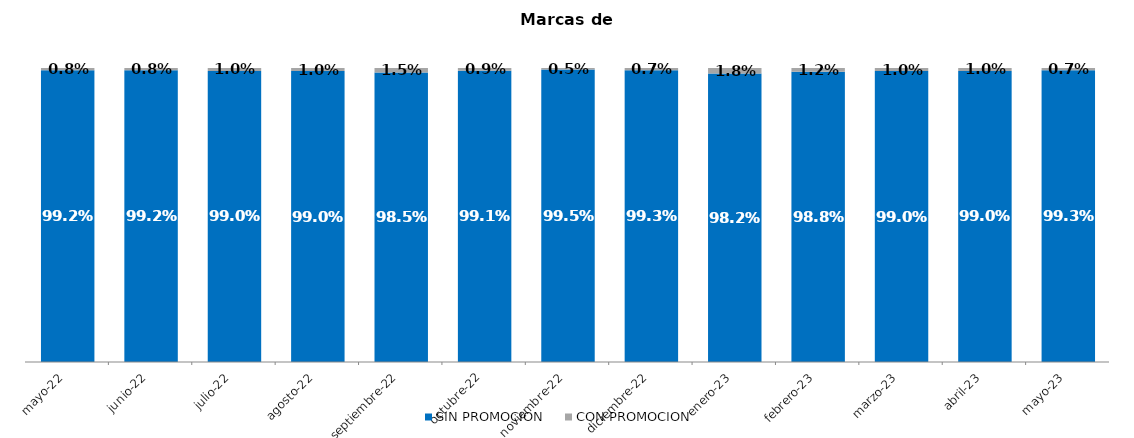
| Category | SIN PROMOCION   | CON PROMOCION   |
|---|---|---|
| 2022-05-01 | 0.992 | 0.008 |
| 2022-06-01 | 0.992 | 0.008 |
| 2022-07-01 | 0.99 | 0.01 |
| 2022-08-01 | 0.99 | 0.01 |
| 2022-09-01 | 0.985 | 0.015 |
| 2022-10-01 | 0.991 | 0.009 |
| 2022-11-01 | 0.995 | 0.005 |
| 2022-12-01 | 0.993 | 0.007 |
| 2023-01-01 | 0.982 | 0.018 |
| 2023-02-01 | 0.988 | 0.012 |
| 2023-03-01 | 0.99 | 0.01 |
| 2023-04-01 | 0.99 | 0.01 |
| 2023-05-01 | 0.993 | 0.007 |